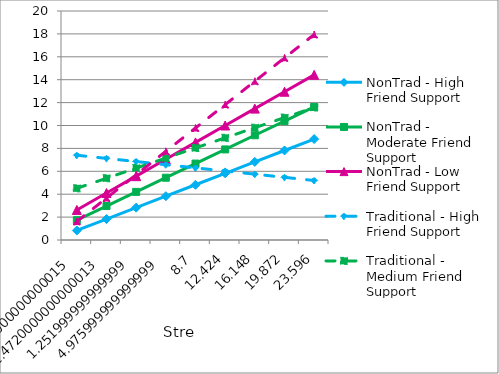
| Category | NonTrad - High Friend Support | NonTrad - Moderate Friend Support | NonTrad - Low Friend Support | Traditional - High Friend Support | Traditional - Medium Friend Support | Traditional - Low  Friend Support |
|---|---|---|---|---|---|---|
| -6.1960000000000015 | 0.833 | 1.73 | 2.626 | 7.403 | 4.512 | 1.621 |
| -2.4720000000000013 | 1.831 | 2.966 | 4.101 | 7.127 | 5.394 | 3.662 |
| 1.251999999999999 | 2.829 | 4.202 | 5.576 | 6.851 | 6.277 | 5.702 |
| 4.975999999999999 | 3.827 | 5.439 | 7.051 | 6.576 | 7.159 | 7.743 |
| 8.7 | 4.825 | 6.675 | 8.525 | 6.3 | 8.042 | 9.784 |
| 12.424 | 5.822 | 7.911 | 10 | 6.024 | 8.925 | 11.825 |
| 16.148 | 6.82 | 9.148 | 11.475 | 5.749 | 9.807 | 13.866 |
| 19.872 | 7.818 | 10.384 | 12.95 | 5.473 | 10.69 | 15.906 |
| 23.596 | 8.816 | 11.62 | 14.425 | 5.198 | 11.572 | 17.947 |